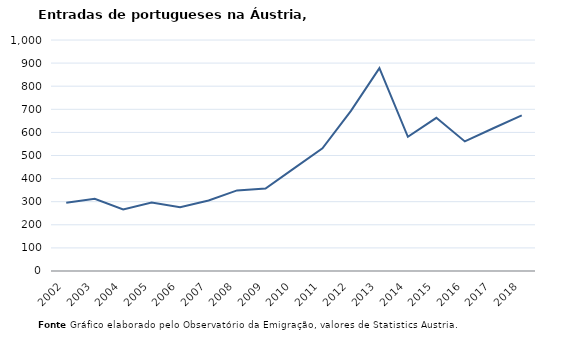
| Category | Entradas |
|---|---|
| 2002.0 | 295 |
| 2003.0 | 313 |
| 2004.0 | 266 |
| 2005.0 | 296 |
| 2006.0 | 276 |
| 2007.0 | 305 |
| 2008.0 | 349 |
| 2009.0 | 357 |
| 2010.0 | 444 |
| 2011.0 | 531 |
| 2012.0 | 693 |
| 2013.0 | 878 |
| 2014.0 | 581 |
| 2015.0 | 663 |
| 2016.0 | 561 |
| 2017.0 | 618 |
| 2018.0 | 674 |